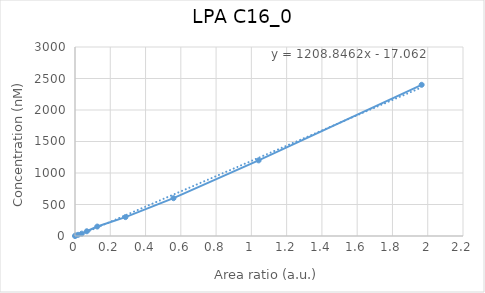
| Category | LPA C16_0 |
|---|---|
| 0.0 | 0 |
| 0.00348763 | 9.375 |
| 0.0177961 | 18.75 |
| 0.0382955 | 37.5 |
| 0.0670418 | 75 |
| 0.126284 | 150 |
| 0.286125 | 300 |
| 0.558466 | 600 |
| 1.04104 | 1200 |
| 1.96558 | 2400 |